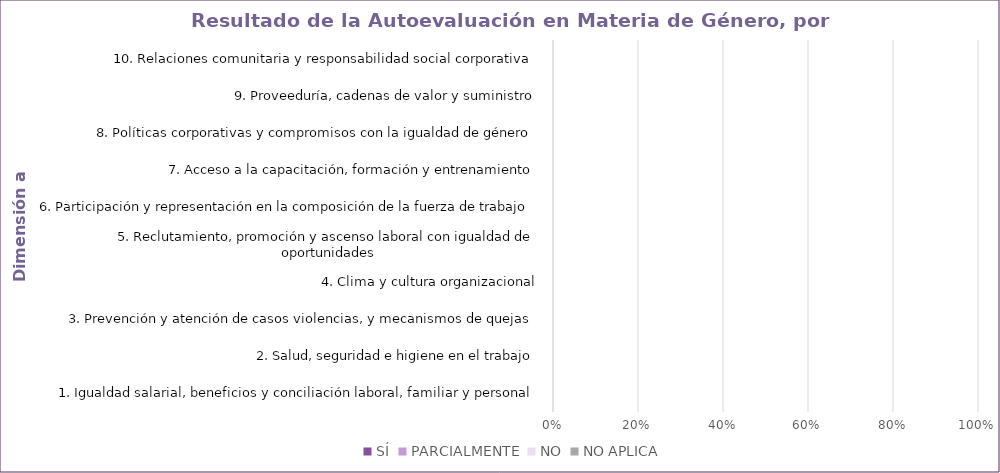
| Category | SÍ | PARCIALMENTE | NO | NO APLICA |
|---|---|---|---|---|
| 1. Igualdad salarial, beneficios y conciliación laboral, familiar y personal | 0 | 0 | 0 | 0 |
| 2. Salud, seguridad e higiene en el trabajo | 0 | 0 | 0 | 0 |
| 3. Prevención y atención de casos violencias, y mecanismos de quejas | 0 | 0 | 0 | 0 |
| 4. Clima y cultura organizacional | 0 | 0 | 0 | 0 |
| 5. Reclutamiento, promoción y ascenso laboral con igualdad de oportunidades | 0 | 0 | 0 | 0 |
| 6. Participación y representación en la composición de la fuerza de trabajo | 0 | 0 | 0 | 0 |
| 7. Acceso a la capacitación, formación y entrenamiento | 0 | 0 | 0 | 0 |
| 8. Políticas corporativas y compromisos con la igualdad de género | 0 | 0 | 0 | 0 |
| 9. Proveeduría, cadenas de valor y suministro | 0 | 0 | 0 | 0 |
| 10. Relaciones comunitaria y responsabilidad social corporativa | 0 | 0 | 0 | 0 |